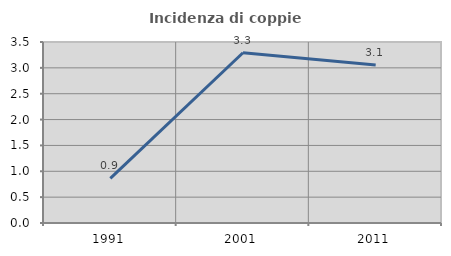
| Category | Incidenza di coppie miste |
|---|---|
| 1991.0 | 0.862 |
| 2001.0 | 3.292 |
| 2011.0 | 3.057 |